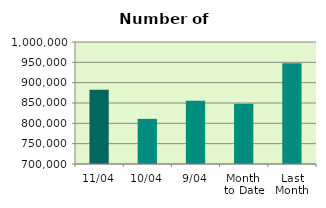
| Category | Series 0 |
|---|---|
| 11/04 | 882616 |
| 10/04 | 810938 |
| 9/04 | 855344 |
| Month 
to Date | 848162.222 |
| Last
Month | 947588.19 |